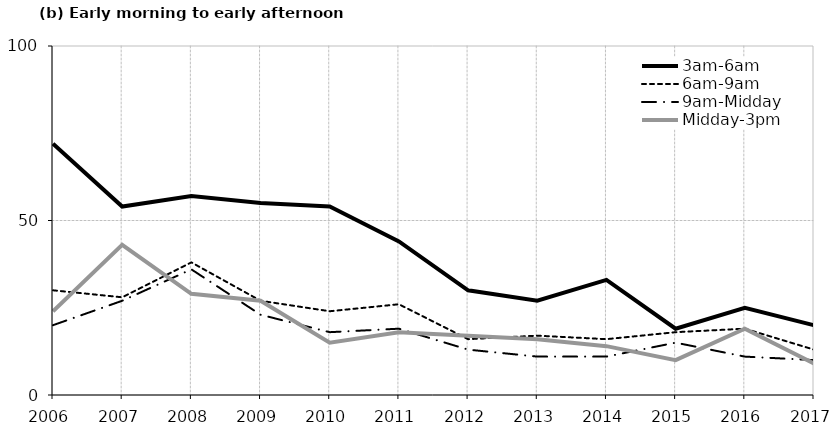
| Category | 3am-6am | 6am-9am | 9am-Midday | Midday-3pm |
|---|---|---|---|---|
| 2006.0 | 72 | 30 | 20 | 24 |
| 2007.0 | 54 | 28 | 27 | 43 |
| 2008.0 | 57 | 38 | 36 | 29 |
| 2009.0 | 55 | 27 | 23 | 27 |
| 2010.0 | 54 | 24 | 18 | 15 |
| 2011.0 | 44 | 26 | 19 | 18 |
| 2012.0 | 30 | 16 | 13 | 17 |
| 2013.0 | 27 | 17 | 11 | 16 |
| 2014.0 | 33 | 16 | 11 | 14 |
| 2015.0 | 19 | 18 | 15 | 10 |
| 2016.0 | 25 | 19 | 11 | 19 |
| 2017.0 | 20 | 13 | 10 | 9 |